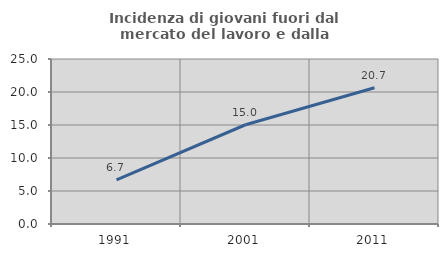
| Category | Incidenza di giovani fuori dal mercato del lavoro e dalla formazione  |
|---|---|
| 1991.0 | 6.695 |
| 2001.0 | 15.038 |
| 2011.0 | 20.652 |